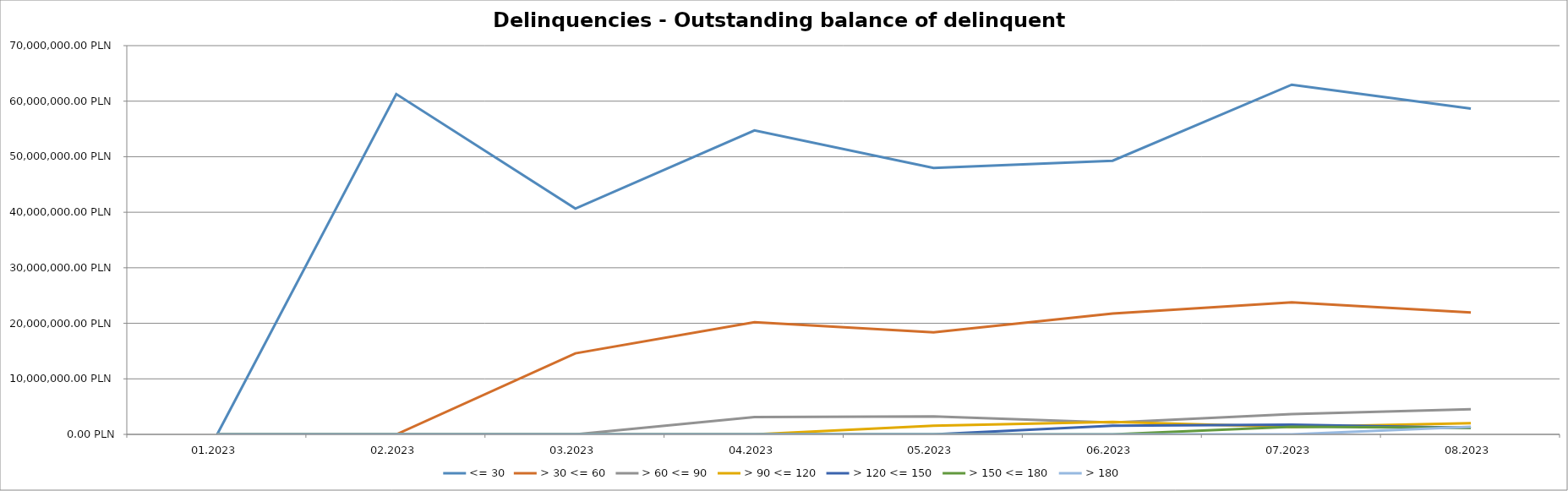
| Category | <= 30 | > 30 <= 60 | > 60 <= 90 | > 90 <= 120 | > 120 <= 150 | > 150 <= 180 | > 180 |
|---|---|---|---|---|---|---|---|
| 01.2023 | 0 | 0 | 0 | 0 | 0 | 0 | 0 |
| 02.2023 | 61279332.52 | 0 | 0 | 0 | 0 | 0 | 0 |
| 03.2023 | 40663789.15 | 14592814.21 | 0 | 0 | 0 | 0 | 0 |
| 04.2023 | 54729258.98 | 20207986.71 | 3105470.81 | 0 | 0 | 0 | 0 |
| 05.2023 | 47980491.52 | 18365026.23 | 3236930.39 | 1575049.71 | 0 | 0 | 0 |
| 06.2023 | 49274463.43 | 21757116.33 | 2145346.9 | 2234258.08 | 1546159.58 | 0 | 0 |
| 07.2023 | 62971390.96 | 23765504.45 | 3638339.96 | 1315739.52 | 1741228.92 | 1367122.32 | 0 |
| 08.2023 | 58667444.31 | 21958530.42 | 4534282.61 | 1998402.31 | 1197894.69 | 1186456.03 | 1367122.32 |